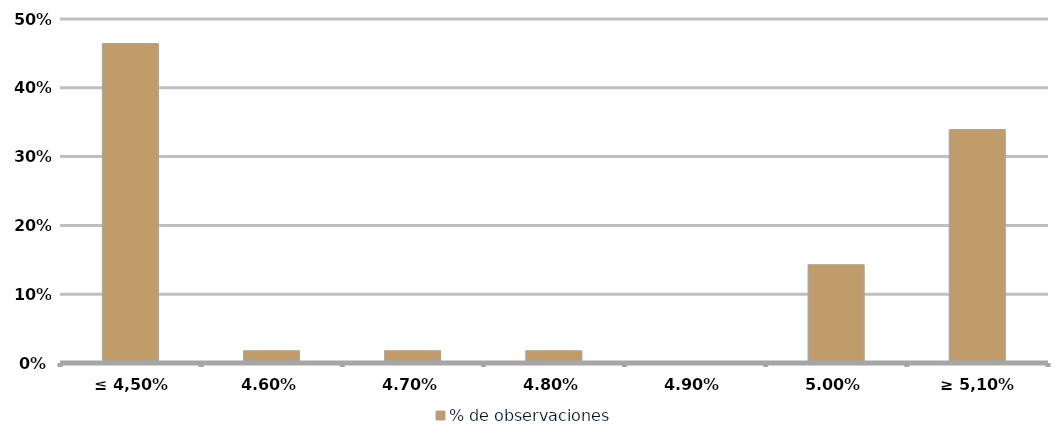
| Category | % de observaciones  |
|---|---|
| ≤ 4,50% | 0.464 |
| 4,60% | 0.018 |
| 4,70% | 0.018 |
| 4,80% | 0.018 |
| 4,90% | 0 |
| 5,00% | 0.143 |
| ≥ 5,10% | 0.339 |